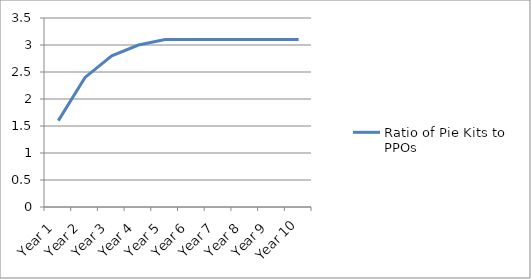
| Category | Ratio of Pie Kits to PPOs |
|---|---|
| Year 1 | 1.6 |
| Year 2 | 2.4 |
| Year 3 | 2.8 |
| Year 4 | 3 |
| Year 5 | 3.1 |
| Year 6 | 3.1 |
| Year 7 | 3.1 |
| Year 8 | 3.1 |
| Year 9 | 3.1 |
| Year 10 | 3.1 |